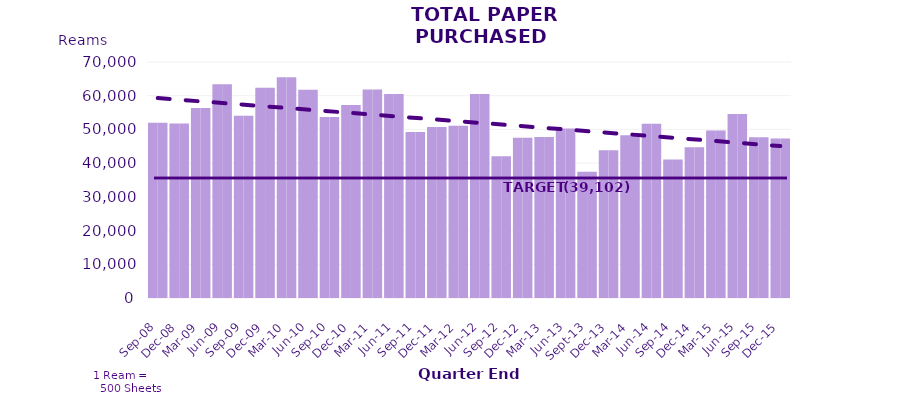
| Category | Series 0 | Series 1 |
|---|---|---|
| Sep-08 | 51950 | 51950 |
| Dec-08 | 51730 | 51730 |
| Mar-09 | 56330 | 56330 |
| Jun-09 | 63430 | 63430 |
| Sep-09 | 54085 | 54085 |
| Dec-09 | 62360 | 62360 |
| Mar-10 | 65470 | 65470 |
| Jun-10 | 61755 | 61755 |
| Sep-10 | 53651 | 53651 |
| Dec-10 | 57234 | 57234 |
| Mar-11 | 61827 | 61827 |
| Jun-11 | 60514 | 60514 |
| Sep-11 | 49209 | 49209 |
| Dec-11 | 50752 | 50752 |
| Mar-12 | 51112 | 51112 |
| Jun-12 | 60514 | 60514 |
| Sep-12 | 42064 | 42064 |
| Dec-12 | 47522 | 47522 |
| Mar-13 | 47733 | 47733 |
| Jun-13 | 50250 | 50250 |
| Sep-13 | 37449 | 37449 |
| Dec-13 | 43823 | 43823 |
| Mar-14 | 48258 | 48258 |
| Jun-14 | 51675 | 51675 |
| Sep-14 | 41095 | 41095 |
| Dec-14 | 44735 | 44735 |
| Mar-15 | 49682 | 49682 |
| Jun-15 | 54546 | 54546 |
| Sep-15 | 47713 | 47713 |
| Dec-15 | 47289 | 47289 |